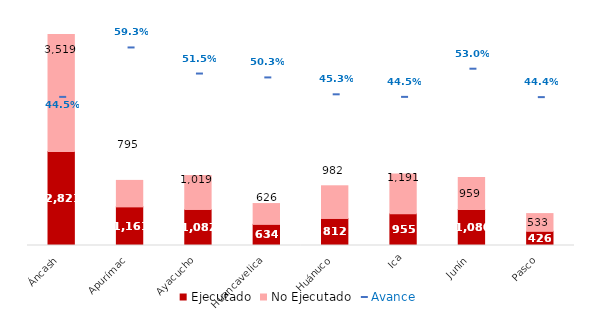
| Category | Ejecutado | No Ejecutado |
|---|---|---|
| Áncash | 2821.1 | 3518.833 |
| Apurímac | 1160.538 | 794.938 |
| Ayacucho | 1082.471 | 1018.927 |
| Huancavelica | 634.373 | 625.695 |
| Huánuco | 812.059 | 981.72 |
| Ica | 955.401 | 1191.491 |
| Junín | 1080.285 | 959.366 |
| Pasco | 425.855 | 532.715 |